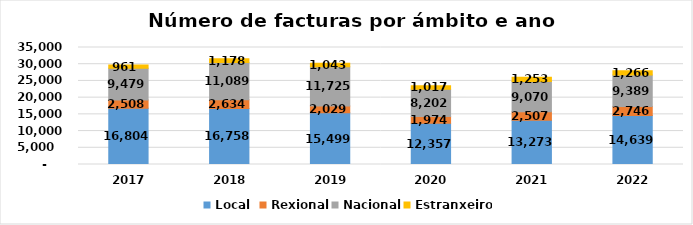
| Category | Local  | Rexional | Nacional | Estranxeiro |
|---|---|---|---|---|
| 2017.0 | 16804 | 2508 | 9479 | 961 |
| 2018.0 | 16758 | 2634 | 11089 | 1178 |
| 2019.0 | 15499 | 2029 | 11725 | 1043 |
| 2020.0 | 12357 | 1974 | 8202 | 1017 |
| 2021.0 | 13273 | 2507 | 9070 | 1253 |
| 2022.0 | 14639 | 2746 | 9389 | 1266 |